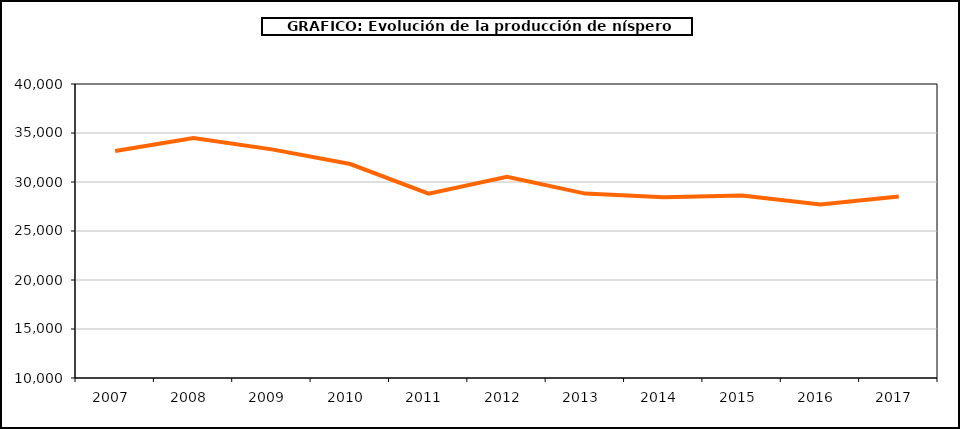
| Category | producción níspero |
|---|---|
| 2007.0 | 33158 |
| 2008.0 | 34484 |
| 2009.0 | 33328 |
| 2010.0 | 31834 |
| 2011.0 | 28812 |
| 2012.0 | 30529 |
| 2013.0 | 28815 |
| 2014.0 | 28449 |
| 2015.0 | 28620 |
| 2016.0 | 27712 |
| 2017.0 | 28522 |